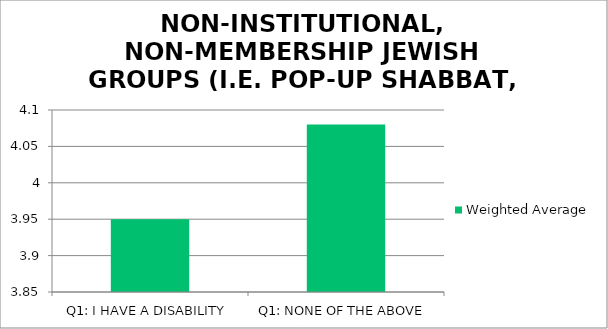
| Category | Weighted Average |
|---|---|
| Q1: I HAVE A DISABILITY | 3.95 |
| Q1: NONE OF THE ABOVE | 4.08 |